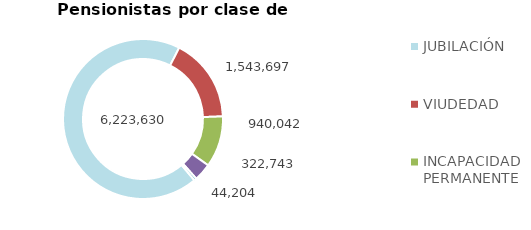
| Category | Series 0 |
|---|---|
| JUBILACIÓN | 6223630 |
| VIUDEDAD | 1543697 |
| INCAPACIDAD PERMANENTE | 940042 |
| ORFANDAD | 322743 |
| FAVOR DE FAMILIARES | 44204 |